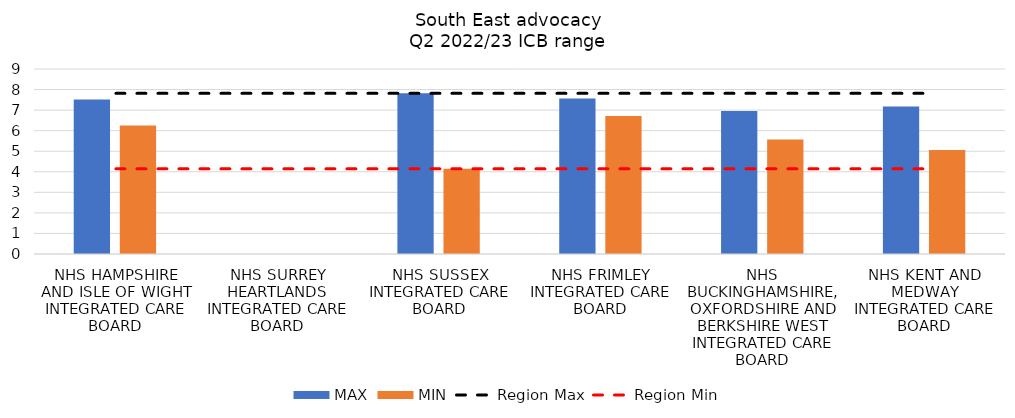
| Category | MAX | MIN |
|---|---|---|
| NHS HAMPSHIRE AND ISLE OF WIGHT INTEGRATED CARE BOARD | 7.518 | 6.257 |
| NHS SURREY HEARTLANDS INTEGRATED CARE BOARD | 0 | 0 |
| NHS SUSSEX INTEGRATED CARE BOARD | 7.814 | 4.144 |
| NHS FRIMLEY INTEGRATED CARE BOARD | 7.559 | 6.709 |
| NHS BUCKINGHAMSHIRE, OXFORDSHIRE AND BERKSHIRE WEST INTEGRATED CARE BOARD | 6.953 | 5.566 |
| NHS KENT AND MEDWAY INTEGRATED CARE BOARD | 7.17 | 5.061 |